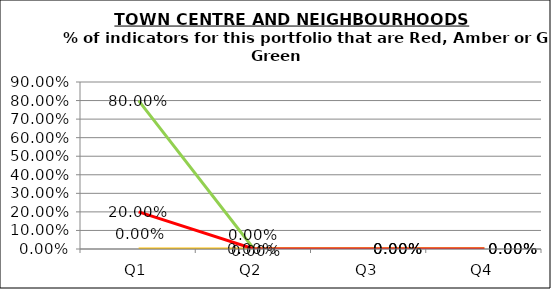
| Category | Green | Amber | Red |
|---|---|---|---|
| Q1 | 0.8 | 0 | 0.2 |
| Q2 | 0 | 0 | 0 |
| Q3 | 0 | 0 | 0 |
| Q4 | 0 | 0 | 0 |